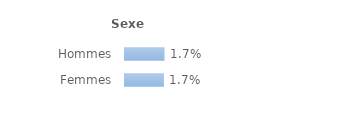
| Category | Series 0 |
|---|---|
| Hommes | 0.017 |
| Femmes | 0.017 |